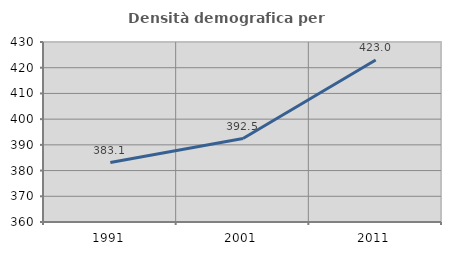
| Category | Densità demografica |
|---|---|
| 1991.0 | 383.129 |
| 2001.0 | 392.464 |
| 2011.0 | 423.03 |